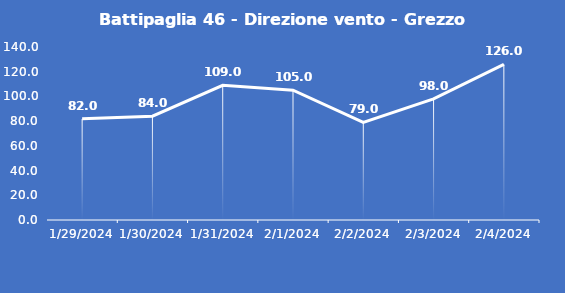
| Category | Battipaglia 46 - Direzione vento - Grezzo (°N) |
|---|---|
| 1/29/24 | 82 |
| 1/30/24 | 84 |
| 1/31/24 | 109 |
| 2/1/24 | 105 |
| 2/2/24 | 79 |
| 2/3/24 | 98 |
| 2/4/24 | 126 |